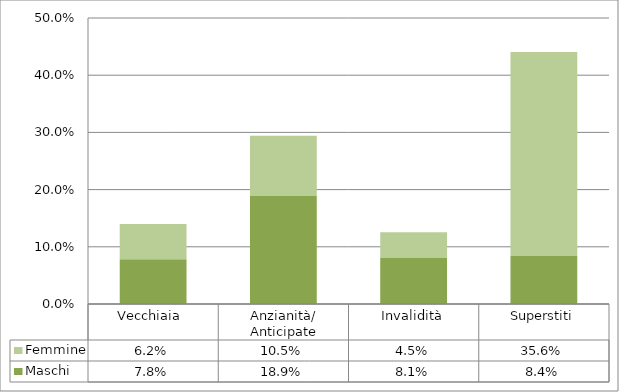
| Category | Maschi | Femmine |
|---|---|---|
| Vecchiaia  | 0.078 | 0.062 |
| Anzianità/ Anticipate | 0.189 | 0.105 |
| Invalidità | 0.081 | 0.045 |
| Superstiti | 0.084 | 0.356 |